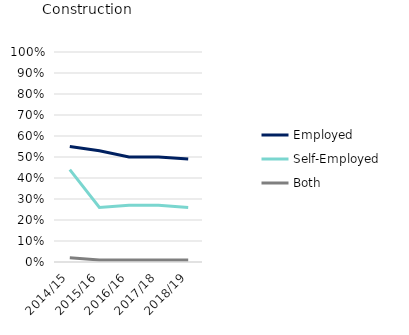
| Category | Employed | Self-Employed | Both |
|---|---|---|---|
| 2014/15 | 0.55 | 0.44 | 0.02 |
| 2015/16 | 0.53 | 0.26 | 0.01 |
| 2016/16 | 0.5 | 0.27 | 0.01 |
| 2017/18 | 0.5 | 0.27 | 0.01 |
| 2018/19 | 0.49 | 0.26 | 0.01 |